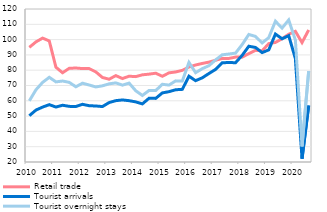
| Category | Retail trade  | Tourist arrivals  | Tourist overnight stays  |
|---|---|---|---|
| 2010 | 94.925 | 50.266 | 59.973 |
| II | 98.522 | 53.953 | 67.226 |
| III | 100.975 | 55.9 | 72.043 |
| IV | 99.107 | 57.473 | 75.355 |
| 2011 | 81.945 | 55.923 | 72.373 |
| II | 78.324 | 57.088 | 72.922 |
| III | 81.25 | 56.36 | 72.063 |
| IV | 81.428 | 56.282 | 69.176 |
| 2012 | 81.061 | 57.704 | 71.507 |
| II | 81.054 | 56.781 | 70.322 |
| III | 78.874 | 56.611 | 69.056 |
| IV | 75.235 | 56.235 | 69.806 |
| 2013 | 74.11 | 58.857 | 71.076 |
| II | 76.461 | 60.093 | 71.717 |
| III | 74.547 | 60.562 | 70.226 |
| IV | 76.072 | 60.081 | 71.573 |
| 2014 | 75.802 | 59.283 | 66.563 |
| II | 76.983 | 57.981 | 63.49 |
| III | 77.418 | 61.67 | 66.741 |
| IV | 78.034 | 61.577 | 66.69 |
| 2015 | 76.023 | 65.171 | 70.801 |
| II | 78.274 | 65.969 | 70.274 |
| III | 78.85 | 67.222 | 73.025 |
| IV | 79.908 | 67.47 | 72.89 |
| 2016 | 82.068 | 76.07 | 85.097 |
| II | 83.41 | 73.152 | 78.396 |
| III | 84.415 | 75.017 | 80.989 |
| IV | 85.268 | 77.824 | 82.945 |
| 2017 | 86.507 | 80.516 | 86.721 |
| II | 87.676 | 84.849 | 90.058 |
| III | 87.684 | 85.041 | 90.566 |
| IV | 88.567 | 84.884 | 91.156 |
| 2018 | 88.542 | 89.696 | 96.749 |
| II | 90.825 | 95.668 | 103.345 |
| III | 92.994 | 94.867 | 102.099 |
| IV | 92.653 | 91.522 | 97.807 |
| 2019 | 97.386 | 93.267 | 101.31 |
| II | 98.143 | 103.627 | 111.998 |
| III | 100.566 | 100.55 | 107.535 |
| IV | 103.509 | 102.556 | 112.84 |
| 2020 | 105.413 | 87.646 | 99.77 |
| II | 98.075 | 22.121 | 30.164 |
| III | 106.278 | 56.945 | 79.399 |